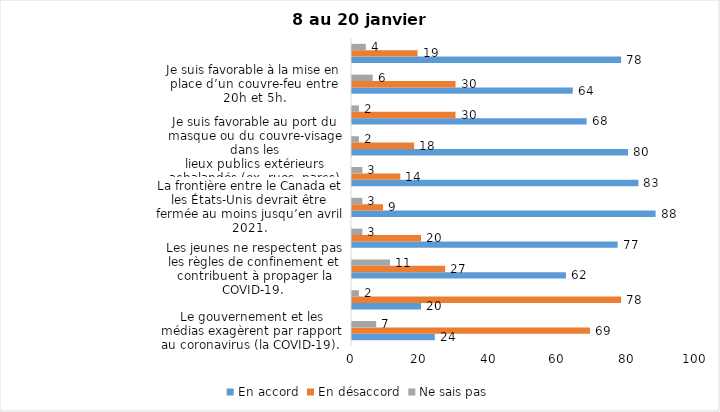
| Category | En accord | En désaccord | Ne sais pas |
|---|---|---|---|
| Le gouvernement et les médias exagèrent par rapport au coronavirus (la COVID-19). | 24 | 69 | 7 |
| Il est exagéré de rester chez soi pour se protéger contre le coronavirus (la COVID-19). | 20 | 78 | 2 |
| Les jeunes ne respectent pas les règles de confinement et contribuent à propager la COVID-19. | 62 | 27 | 11 |
| C’est une bonne chose que les policiers puissent donner facilement des contraventions aux gens qui ne respectent pas les mesures pour prévenir le coronavirus (la COVID-19). | 77 | 20 | 3 |
| La frontière entre le Canada et les États-Unis devrait être fermée au moins jusqu’en avril 2021. | 88 | 9 | 3 |
| J’ai peur que le système de santé soit débordé par les cas de COVID-19 suite à la période des fêtes. | 83 | 14 | 3 |
| Je suis favorable au port du masque ou du couvre-visage dans les
lieux publics extérieurs achalandés (ex. rues, parcs) | 80 | 18 | 2 |
| Je suis favorable à la prolongation de la fermeture des services et commerces non essentiels (salons de coiffure, magasins, industries) jusqu’au 8 février. | 68 | 30 | 2 |
| Je suis favorable à la mise en place d’un couvre-feu entre 20h et 5h. | 64 | 30 | 6 |
| J’ai peur que le renforcement du confinement dure plus longtemps que prévu. | 78 | 19 | 4 |